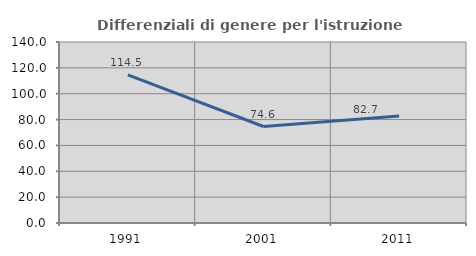
| Category | Differenziali di genere per l'istruzione superiore |
|---|---|
| 1991.0 | 114.506 |
| 2001.0 | 74.629 |
| 2011.0 | 82.72 |